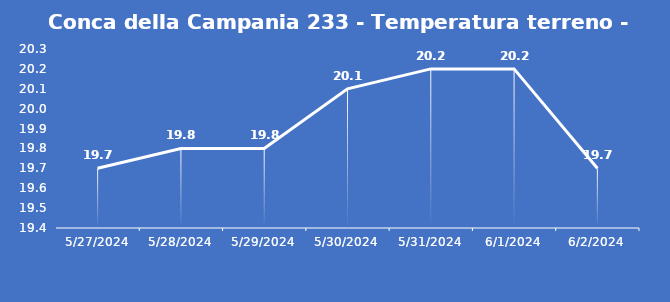
| Category | Conca della Campania 233 - Temperatura terreno - Grezzo (°C) |
|---|---|
| 5/27/24 | 19.7 |
| 5/28/24 | 19.8 |
| 5/29/24 | 19.8 |
| 5/30/24 | 20.1 |
| 5/31/24 | 20.2 |
| 6/1/24 | 20.2 |
| 6/2/24 | 19.7 |